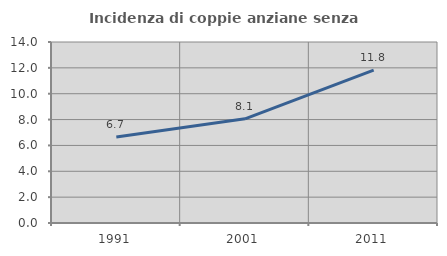
| Category | Incidenza di coppie anziane senza figli  |
|---|---|
| 1991.0 | 6.66 |
| 2001.0 | 8.06 |
| 2011.0 | 11.827 |